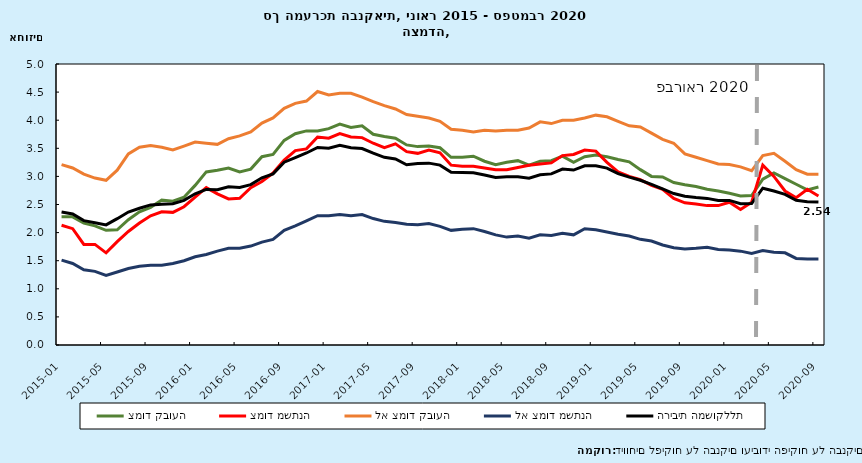
| Category | צמוד קבועה | צמוד משתנה | לא צמוד קבועה | לא צמוד משתנה | הריבית המשוקללת |
|---|---|---|---|---|---|
| 2015-01-31 | 2.28 | 2.13 | 3.21 | 1.51 | 2.368 |
| 2015-02-28 | 2.28 | 2.07 | 3.15 | 1.45 | 2.331 |
| 2015-03-31 | 2.17 | 1.79 | 3.04 | 1.34 | 2.213 |
| 2015-04-30 | 2.12 | 1.79 | 2.97 | 1.31 | 2.175 |
| 2015-05-31 | 2.04 | 1.64 | 2.93 | 1.24 | 2.137 |
| 2015-06-30 | 2.05 | 1.84 | 3.11 | 1.3 | 2.248 |
| 2015-07-31 | 2.23 | 2.02 | 3.4 | 1.36 | 2.366 |
| 2015-08-31 | 2.37 | 2.17 | 3.52 | 1.4 | 2.432 |
| 2015-09-30 | 2.45 | 2.3 | 3.55 | 1.42 | 2.493 |
| 2015-10-31 | 2.58 | 2.37 | 3.52 | 1.42 | 2.506 |
| 2015-11-30 | 2.56 | 2.36 | 3.47 | 1.45 | 2.515 |
| 2015-12-31 | 2.63 | 2.46 | 3.54 | 1.5 | 2.573 |
| 2016-01-31 | 2.84 | 2.63 | 3.61 | 1.57 | 2.691 |
| 2016-02-29 | 3.08 | 2.8 | 3.59 | 1.61 | 2.768 |
| 2016-03-31 | 3.11 | 2.69 | 3.57 | 1.67 | 2.764 |
| 2016-04-30 | 3.15 | 2.6 | 3.67 | 1.72 | 2.814 |
| 2016-05-31 | 3.08 | 2.61 | 3.72 | 1.72 | 2.805 |
| 2016-06-30 | 3.13 | 2.8 | 3.79 | 1.76 | 2.853 |
| 2016-07-31 | 3.35 | 2.91 | 3.95 | 1.83 | 2.975 |
| 2016-08-31 | 3.39 | 3.06 | 4.04 | 1.88 | 3.045 |
| 2016-09-30 | 3.64 | 3.29 | 4.21 | 2.04 | 3.253 |
| 2016-10-31 | 3.76 | 3.46 | 4.3 | 2.12 | 3.334 |
| 2016-11-30 | 3.81 | 3.49 | 4.34 | 2.21 | 3.417 |
| 2016-12-31 | 3.81 | 3.7 | 4.51 | 2.3 | 3.514 |
| 2017-01-31 | 3.85 | 3.68 | 4.45 | 2.3 | 3.502 |
| 2017-02-28 | 3.93 | 3.76 | 4.48 | 2.32 | 3.554 |
| 2017-03-31 | 3.87 | 3.7 | 4.48 | 2.3 | 3.511 |
| 2017-04-30 | 3.9 | 3.69 | 4.41 | 2.32 | 3.496 |
| 2017-05-31 | 3.75 | 3.59 | 4.33 | 2.25 | 3.415 |
| 2017-06-30 | 3.71 | 3.51 | 4.26 | 2.2 | 3.339 |
| 2017-07-31 | 3.68 | 3.58 | 4.2 | 2.18 | 3.31 |
| 2017-08-31 | 3.56 | 3.44 | 4.1 | 2.15 | 3.206 |
| 2017-09-30 | 3.53 | 3.41 | 4.07 | 2.14 | 3.23 |
| 2017-10-31 | 3.54 | 3.47 | 4.04 | 2.16 | 3.236 |
| 2017-11-30 | 3.51 | 3.42 | 3.98 | 2.11 | 3.2 |
| 2017-12-31 | 3.34 | 3.2 | 3.84 | 2.04 | 3.072 |
| 2018-01-31 | 3.34 | 3.18 | 3.82 | 2.06 | 3.072 |
| 2018-02-28 | 3.36 | 3.18 | 3.79 | 2.07 | 3.063 |
| 2018-03-31 | 3.27 | 3.15 | 3.82 | 2.02 | 3.026 |
| 2018-04-30 | 3.21 | 3.12 | 3.81 | 1.96 | 2.981 |
| 2018-05-31 | 3.25 | 3.12 | 3.82 | 1.92 | 2.992 |
| 2018-06-30 | 3.28 | 3.16 | 3.82 | 1.94 | 2.993 |
| 2018-07-31 | 3.2 | 3.2 | 3.86 | 1.9 | 2.967 |
| 2018-08-31 | 3.27 | 3.22 | 3.97 | 1.96 | 3.029 |
| 2018-09-30 | 3.28 | 3.24 | 3.94 | 1.95 | 3.045 |
| 2018-10-31 | 3.36 | 3.37 | 4 | 1.99 | 3.13 |
| 2018-11-30 | 3.25 | 3.39 | 4 | 1.96 | 3.113 |
| 2018-12-31 | 3.35 | 3.47 | 4.04 | 2.07 | 3.188 |
| 2019-01-31 | 3.38 | 3.45 | 4.09 | 2.05 | 3.191 |
| 2019-02-28 | 3.35 | 3.25 | 4.06 | 2.01 | 3.147 |
| 2019-03-31 | 3.3 | 3.08 | 3.98 | 1.97 | 3.049 |
| 2019-04-30 | 3.26 | 3 | 3.9 | 1.94 | 2.987 |
| 2019-05-31 | 3.12 | 2.94 | 3.88 | 1.88 | 2.931 |
| 2019-06-30 | 3 | 2.84 | 3.77 | 1.85 | 2.858 |
| 2019-07-31 | 2.99 | 2.77 | 3.66 | 1.78 | 2.777 |
| 2019-08-31 | 2.89 | 2.61 | 3.59 | 1.73 | 2.695 |
| 2019-09-30 | 2.85 | 2.53 | 3.4 | 1.71 | 2.646 |
| 2019-10-31 | 2.82 | 2.51 | 3.34 | 1.72 | 2.624 |
| 2019-11-30 | 2.77 | 2.48 | 3.28 | 1.74 | 2.609 |
| 2019-12-31 | 2.74 | 2.48 | 3.22 | 1.7 | 2.572 |
| 2020-01-31 | 2.7 | 2.54 | 3.21 | 1.69 | 2.573 |
| 2020-02-29 | 2.65 | 2.41 | 3.17 | 1.67 | 2.513 |
| 2020-03-31 | 2.66 | 2.54 | 3.1 | 1.63 | 2.516 |
| 2020-04-30 | 2.95 | 3.2 | 3.37 | 1.68 | 2.79 |
| 2020-05-31 | 3.06 | 3 | 3.41 | 1.65 | 2.739 |
| 2020-06-30 | 2.96 | 2.74 | 3.27 | 1.64 | 2.681 |
| 2020-07-31 | 2.86 | 2.62 | 3.12 | 1.54 | 2.574 |
| 2020-08-31 | 2.76 | 2.77 | 3.04 | 1.53 | 2.551 |
| 2020-09-30 | 2.81 | 2.65 | 3.04 | 1.53 | 2.544 |